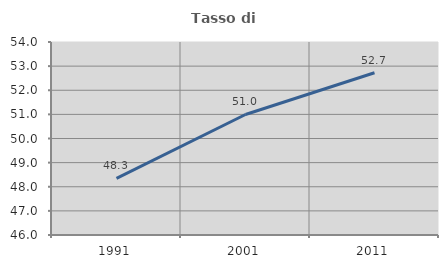
| Category | Tasso di occupazione   |
|---|---|
| 1991.0 | 48.347 |
| 2001.0 | 50.996 |
| 2011.0 | 52.725 |